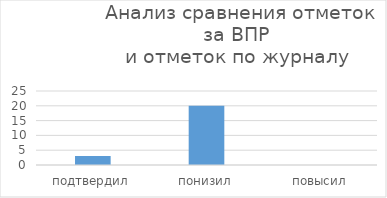
| Category | Series 0 |
|---|---|
| подтвердил | 3 |
| понизил | 20 |
| повысил | 0 |